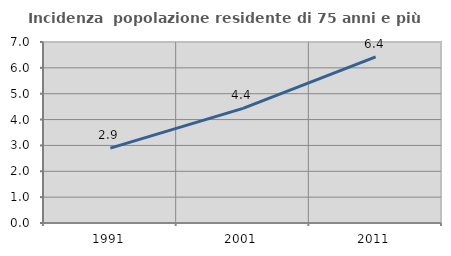
| Category | Incidenza  popolazione residente di 75 anni e più |
|---|---|
| 1991.0 | 2.894 |
| 2001.0 | 4.431 |
| 2011.0 | 6.424 |